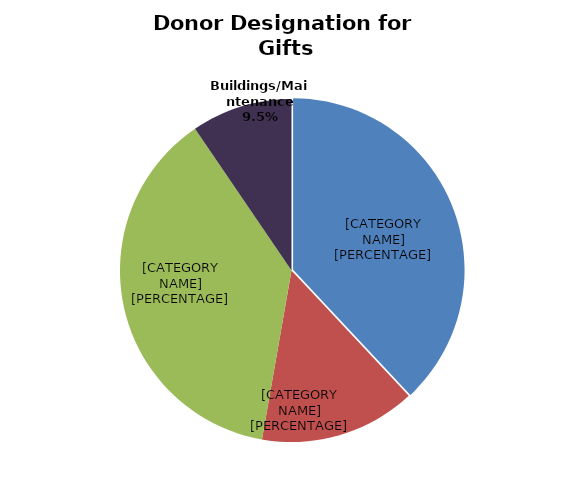
| Category | Series 0 |
|---|---|
| Student Financial Aid | 0.38 |
| Faculty and Staff Support | 0.147 |
| Colleges/Admin. Support | 0.377 |
| Buildings/Maintenance | 0.095 |